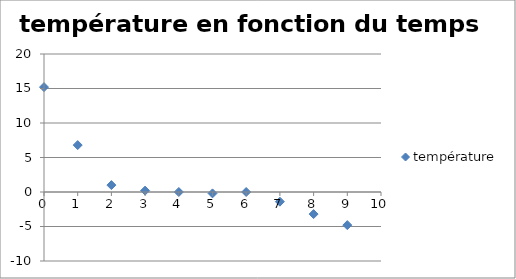
| Category | température |
|---|---|
| 0.0 | 15.2 |
| 1.0 | 6.8 |
| 2.0 | 1 |
| 3.0 | 0.2 |
| 4.0 | 0 |
| 5.0 | -0.2 |
| 6.0 | 0 |
| 7.0 | -1.4 |
| 8.0 | -3.2 |
| 9.0 | -4.8 |